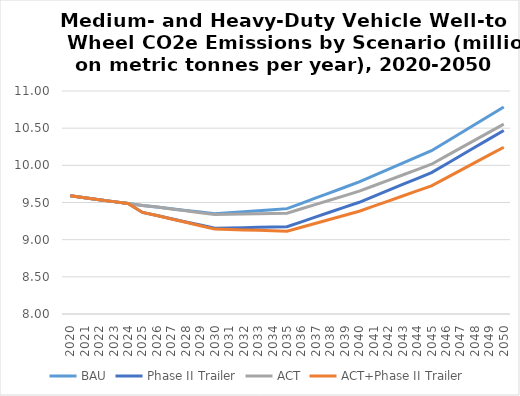
| Category | BAU | Phase II Trailer | ACT | ACT+Phase II Trailer |
|---|---|---|---|---|
| 2020.0 | 9.59 | 9.59 | 9.59 | 9.59 |
| 2021.0 | 9.564 | 9.564 | 9.564 | 9.564 |
| 2022.0 | 9.538 | 9.538 | 9.538 | 9.538 |
| 2023.0 | 9.512 | 9.512 | 9.512 | 9.512 |
| 2024.0 | 9.486 | 9.486 | 9.486 | 9.486 |
| 2025.0 | 9.46 | 9.367 | 9.46 | 9.367 |
| 2026.0 | 9.438 | 9.324 | 9.438 | 9.324 |
| 2027.0 | 9.416 | 9.281 | 9.413 | 9.279 |
| 2028.0 | 9.394 | 9.239 | 9.388 | 9.233 |
| 2029.0 | 9.371 | 9.196 | 9.363 | 9.188 |
| 2030.0 | 9.349 | 9.153 | 9.338 | 9.142 |
| 2031.0 | 9.363 | 9.158 | 9.341 | 9.137 |
| 2032.0 | 9.376 | 9.162 | 9.345 | 9.131 |
| 2033.0 | 9.39 | 9.166 | 9.349 | 9.126 |
| 2034.0 | 9.404 | 9.17 | 9.352 | 9.12 |
| 2035.0 | 9.417 | 9.175 | 9.356 | 9.114 |
| 2036.0 | 9.489 | 9.24 | 9.415 | 9.168 |
| 2037.0 | 9.561 | 9.306 | 9.475 | 9.221 |
| 2038.0 | 9.633 | 9.372 | 9.534 | 9.275 |
| 2039.0 | 9.705 | 9.437 | 9.593 | 9.328 |
| 2040.0 | 9.777 | 9.503 | 9.653 | 9.382 |
| 2041.0 | 9.861 | 9.583 | 9.725 | 9.45 |
| 2042.0 | 9.945 | 9.663 | 9.798 | 9.519 |
| 2043.0 | 10.029 | 9.742 | 9.87 | 9.588 |
| 2044.0 | 10.113 | 9.822 | 9.943 | 9.656 |
| 2045.0 | 10.197 | 9.902 | 10.015 | 9.725 |
| 2046.0 | 10.315 | 10.015 | 10.123 | 9.829 |
| 2047.0 | 10.432 | 10.129 | 10.231 | 9.932 |
| 2048.0 | 10.55 | 10.242 | 10.339 | 10.036 |
| 2049.0 | 10.667 | 10.356 | 10.446 | 10.14 |
| 2050.0 | 10.785 | 10.469 | 10.554 | 10.244 |